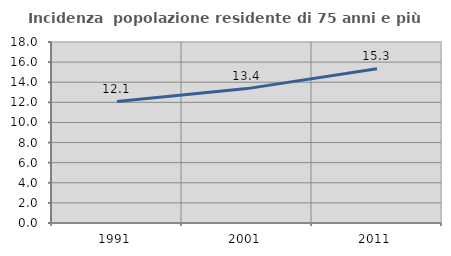
| Category | Incidenza  popolazione residente di 75 anni e più |
|---|---|
| 1991.0 | 12.074 |
| 2001.0 | 13.365 |
| 2011.0 | 15.334 |